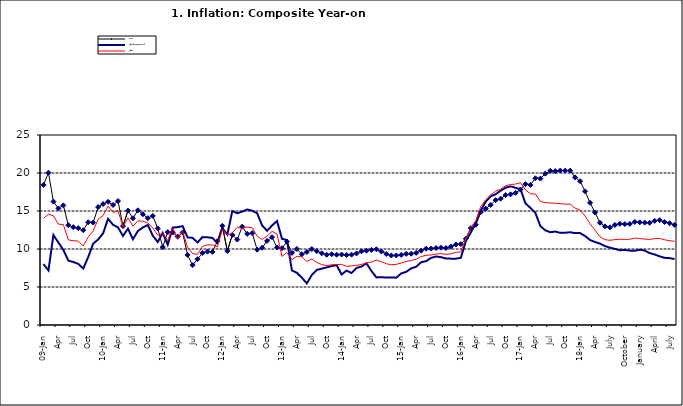
| Category | Food | All Items less Farm Produce | All Items |
|---|---|---|---|
| 09-Jan | 18.436 | 8.013 | 14.034 |
| Feb | 20.041 | 7.178 | 14.584 |
| Mar | 16.233 | 11.842 | 14.366 |
| Apr | 15.342 | 10.85 | 13.268 |
| May | 15.74 | 9.88 | 13.212 |
| June | 13.138 | 8.472 | 11.194 |
| Jul | 12.867 | 8.285 | 11.09 |
| Aug | 12.746 | 8.044 | 11.046 |
| Sep | 12.472 | 7.431 | 10.39 |
| Oct | 13.524 | 8.933 | 11.588 |
| Nov | 13.482 | 10.702 | 12.368 |
| Dec | 15.518 | 11.249 | 13.93 |
| 10-Jan | 15.918 | 12.063 | 14.398 |
| Feb | 16.208 | 13.978 | 15.649 |
| Mar | 15.79 | 13.184 | 14.812 |
| Apr | 16.306 | 12.844 | 15.044 |
| May | 13.023 | 11.711 | 12.915 |
| Jun | 15.053 | 12.686 | 14.099 |
| Jul | 14.043 | 11.287 | 13.002 |
| Aug | 15.09 | 12.366 | 13.702 |
| Sep | 14.57 | 12.83 | 13.65 |
| Oct | 14.065 | 13.168 | 13.45 |
| Nov | 14.351 | 11.746 | 12.766 |
| Dec | 12.701 | 10.917 | 11.815 |
| 11-Jan | 10.255 | 12.118 | 12.08 |
| Feb | 12.221 | 10.569 | 11.1 |
| Mar | 12.169 | 12.815 | 12.779 |
| Apr | 11.629 | 12.882 | 11.291 |
| May | 12.179 | 13.006 | 12.352 |
| Jun | 9.22 | 11.524 | 10.23 |
| Jul | 7.877 | 11.472 | 9.397 |
| Aug | 8.665 | 10.863 | 9.301 |
| Sep | 9.479 | 11.567 | 10.339 |
| Oct | 9.656 | 11.539 | 10.544 |
| Nov | 9.623 | 11.459 | 10.54 |
| Dec | 11.02 | 10.822 | 10.283 |
| 12-Jan | 13.053 | 12.748 | 12.626 |
| 12-Feb | 9.729 | 11.901 | 11.866 |
| 12-Mar | 11.848 | 14.995 | 12.111 |
| Apr | 11.246 | 14.703 | 12.866 |
| May | 12.942 | 14.926 | 12.688 |
| Jun | 11.991 | 15.199 | 12.892 |
| Jul | 12.093 | 15.045 | 12.797 |
| Aug | 9.91 | 14.714 | 11.689 |
| Sep | 10.164 | 13.101 | 11.253 |
| Oct | 11.064 | 12.398 | 11.693 |
| Nov | 11.553 | 13.092 | 12.32 |
| Dec | 10.199 | 13.685 | 11.981 |
| 13-Jan | 10.106 | 11.342 | 9.031 |
| Feb | 10.973 | 11.184 | 9.542 |
| Mar | 9.482 | 7.179 | 8.593 |
| Apr | 10.006 | 6.874 | 9.052 |
| May | 9.321 | 6.227 | 8.964 |
| Jun | 9.606 | 5.472 | 8.353 |
| Jul | 9.994 | 6.58 | 8.682 |
| Aug | 9.723 | 7.245 | 8.231 |
| Sep | 9.437 | 7.41 | 7.952 |
| Oct | 9.249 | 7.579 | 7.807 |
| Nov | 9.313 | 7.75 | 7.931 |
| Dec | 9.253 | 7.872 | 7.957 |
| 14-Jan | 9.271 | 6.648 | 7.977 |
| Feb | 9.207 | 7.166 | 7.707 |
| Mar | 9.254 | 6.836 | 7.783 |
| Apr | 9.414 | 7.508 | 7.851 |
| May | 9.698 | 7.693 | 7.965 |
| Jun | 9.776 | 8.122 | 8.167 |
| Jul | 9.878 | 7.116 | 8.281 |
| Aug | 9.959 | 6.264 | 8.534 |
| Sep | 9.676 | 6.278 | 8.317 |
| Oct | 9.343 | 6.252 | 8.06 |
| Nov | 9.144 | 6.255 | 7.927 |
| Dec | 9.152 | 6.225 | 7.978 |
| 15-Jan | 9.215 | 6.787 | 8.157 |
| Feb | 9.359 | 6.994 | 8.359 |
| Mar | 9.376 | 7.46 | 8.494 |
| Apr | 9.49 | 7.661 | 8.655 |
| May | 9.782 | 8.253 | 9.003 |
| Jun | 10.041 | 8.403 | 9.168 |
| Jul | 10.049 | 8.83 | 9.218 |
| Aug | 10.131 | 9.01 | 9.336 |
| Sep | 10.174 | 8.928 | 9.394 |
| Oct | 10.129 | 8.742 | 9.296 |
| Nov | 10.321 | 8.732 | 9.368 |
| Dec | 10.588 | 8.727 | 9.554 |
| 16-Jan | 10.642 | 8.841 | 9.617 |
| Feb | 11.348 | 11.041 | 11.379 |
| Mar | 12.745 | 12.17 | 12.775 |
| Apr | 13.194 | 13.352 | 13.721 |
| May | 14.861 | 15.054 | 15.577 |
| Jun | 15.302 | 16.224 | 16.48 |
| Jul | 15.799 | 16.929 | 17.127 |
| Aug | 16.427 | 17.208 | 17.609 |
| Sep | 16.622 | 17.666 | 17.852 |
| Oct | 17.09 | 18.067 | 18.33 |
| Nov | 17.191 | 18.241 | 18.476 |
| Dec | 17.388 | 18.052 | 18.547 |
| 17-Jan | 17.818 | 17.867 | 18.719 |
| Feb | 18.528 | 16.011 | 17.78 |
| Mar | 18.436 | 15.404 | 17.256 |
| Apr | 19.303 | 14.75 | 17.244 |
| May | 19.266 | 13.016 | 16.251 |
| Jun | 19.915 | 12.455 | 16.098 |
| Jul | 20.284 | 12.207 | 16.053 |
| Aug | 20.251 | 12.296 | 16.012 |
| Sep | 20.321 | 12.123 | 15.979 |
| Oct | 20.306 | 12.142 | 15.905 |
| Nov | 20.308 | 12.206 | 15.901 |
| Dec | 19.415 | 12.089 | 15.372 |
| 18-Jan | 18.919 | 12.09 | 15.127 |
| Feb | 17.588 | 11.707 | 14.33 |
| Mar | 16.08 | 11.181 | 13.337 |
| Apr | 14.799 | 10.92 | 12.482 |
| May | 13.448 | 10.71 | 11.608 |
| June | 12.977 | 10.387 | 11.231 |
| July | 12.85 | 10.183 | 11.142 |
| August | 13.158 | 10.015 | 11.227 |
| September | 13.309 | 9.838 | 11.284 |
| October | 13.277 | 9.882 | 11.259 |
| November | 13.301 | 9.787 | 11.281 |
| December | 13.559 | 9.771 | 11.442 |
| January | 13.505 | 9.91 | 11.374 |
| February | 13.473 | 9.8 | 11.306 |
| March | 13.451 | 9.461 | 11.251 |
| April | 13.701 | 9.28 | 11.372 |
| May | 13.794 | 9.033 | 11.396 |
| June | 13.558 | 8.841 | 11.217 |
| July | 13.392 | 8.798 | 11.084 |
| August | 13.17 | 8.678 | 11.016 |